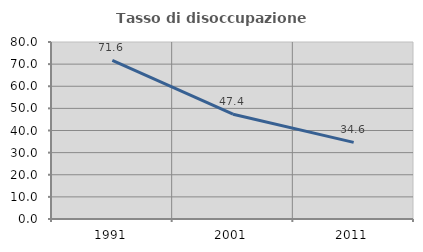
| Category | Tasso di disoccupazione giovanile  |
|---|---|
| 1991.0 | 71.642 |
| 2001.0 | 47.368 |
| 2011.0 | 34.615 |